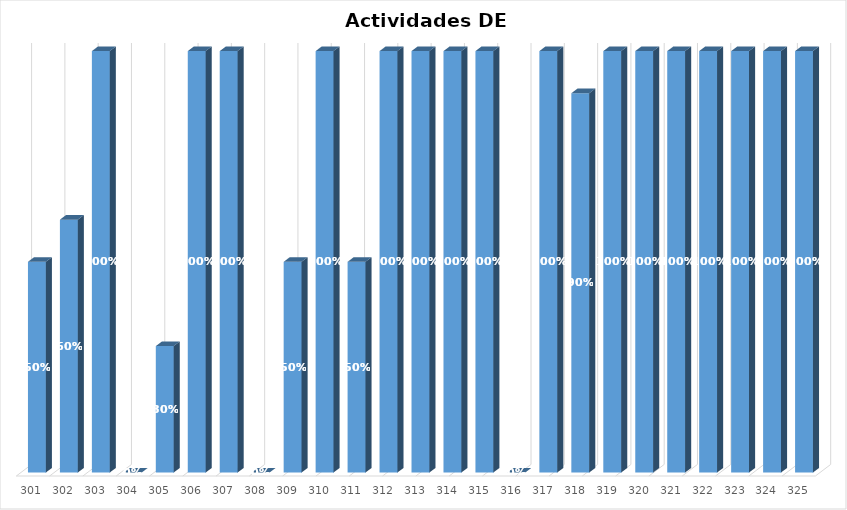
| Category | % Avance |
|---|---|
| 301.0 | 0.5 |
| 302.0 | 0.6 |
| 303.0 | 1 |
| 304.0 | 0 |
| 305.0 | 0.3 |
| 306.0 | 1 |
| 307.0 | 1 |
| 308.0 | 0 |
| 309.0 | 0.5 |
| 310.0 | 1 |
| 311.0 | 0.5 |
| 312.0 | 1 |
| 313.0 | 1 |
| 314.0 | 1 |
| 315.0 | 1 |
| 316.0 | 0 |
| 317.0 | 1 |
| 318.0 | 0.9 |
| 319.0 | 1 |
| 320.0 | 1 |
| 321.0 | 1 |
| 322.0 | 1 |
| 323.0 | 1 |
| 324.0 | 1 |
| 325.0 | 1 |